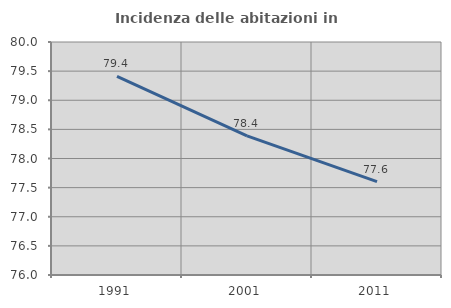
| Category | Incidenza delle abitazioni in proprietà  |
|---|---|
| 1991.0 | 79.412 |
| 2001.0 | 78.387 |
| 2011.0 | 77.603 |